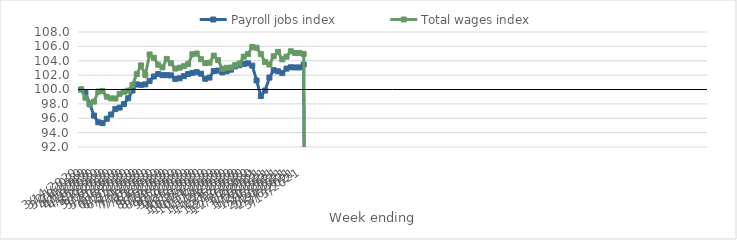
| Category | Payroll jobs index | Total wages index |
|---|---|---|
| 14/03/2020 | 100 | 100 |
| 21/03/2020 | 99.571 | 98.856 |
| 28/03/2020 | 98.029 | 97.919 |
| 04/04/2020 | 96.37 | 98.314 |
| 11/04/2020 | 95.434 | 99.716 |
| 18/04/2020 | 95.316 | 99.773 |
| 25/04/2020 | 95.931 | 98.989 |
| 02/05/2020 | 96.52 | 98.762 |
| 09/05/2020 | 97.291 | 98.747 |
| 16/05/2020 | 97.482 | 99.396 |
| 23/05/2020 | 97.966 | 99.673 |
| 30/05/2020 | 98.782 | 99.837 |
| 06/06/2020 | 99.855 | 100.637 |
| 13/06/2020 | 100.712 | 102.147 |
| 20/06/2020 | 100.65 | 103.351 |
| 27/06/2020 | 100.711 | 102.032 |
| 04/07/2020 | 101.196 | 104.875 |
| 11/07/2020 | 101.812 | 104.412 |
| 18/07/2020 | 102.162 | 103.451 |
| 25/07/2020 | 101.993 | 103.07 |
| 01/08/2020 | 101.993 | 104.257 |
| 08/08/2020 | 101.965 | 103.65 |
| 15/08/2020 | 101.477 | 102.905 |
| 22/08/2020 | 101.562 | 103.035 |
| 29/08/2020 | 101.857 | 103.241 |
| 05/09/2020 | 102.147 | 103.53 |
| 12/09/2020 | 102.307 | 104.909 |
| 19/09/2020 | 102.413 | 105.002 |
| 26/09/2020 | 102.199 | 104.218 |
| 03/10/2020 | 101.487 | 103.686 |
| 10/10/2020 | 101.66 | 103.72 |
| 17/10/2020 | 102.573 | 104.712 |
| 24/10/2020 | 102.635 | 104.088 |
| 31/10/2020 | 102.376 | 102.86 |
| 07/11/2020 | 102.528 | 103.012 |
| 14/11/2020 | 102.758 | 103.055 |
| 21/11/2020 | 103.206 | 103.379 |
| 28/11/2020 | 103.38 | 103.601 |
| 05/12/2020 | 103.57 | 104.572 |
| 12/12/2020 | 103.637 | 104.932 |
| 19/12/2020 | 103.324 | 105.926 |
| 26/12/2020 | 101.253 | 105.811 |
| 02/01/2021 | 99.093 | 104.926 |
| 09/01/2021 | 99.852 | 103.823 |
| 16/01/2021 | 101.656 | 103.474 |
| 23/01/2021 | 102.689 | 104.631 |
| 30/01/2021 | 102.534 | 105.24 |
| 06/02/2021 | 102.282 | 104.196 |
| 13/02/2021 | 102.908 | 104.569 |
| 20/02/2021 | 103.097 | 105.322 |
| 27/02/2021 | 103.069 | 105.08 |
| 06/03/2021 | 103.069 | 105.08 |
| 13/03/2021 | 103.464 | 104.951 |